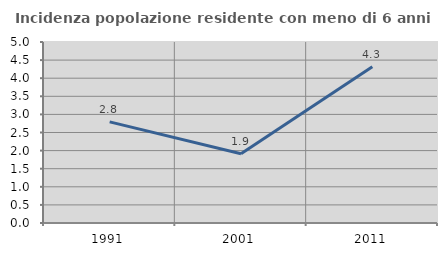
| Category | Incidenza popolazione residente con meno di 6 anni |
|---|---|
| 1991.0 | 2.794 |
| 2001.0 | 1.915 |
| 2011.0 | 4.319 |